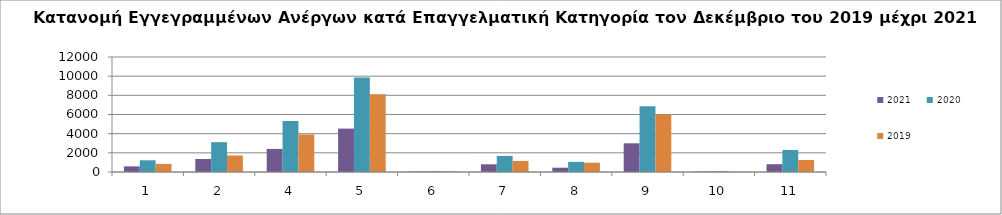
| Category | 2021 | 2020 | 2019 |
|---|---|---|---|
| 1.0 | 589 | 1223 | 843 |
| 2.0 | 1358 | 3111 | 1724 |
| 4.0 | 2407 | 5325 | 3914 |
| 5.0 | 4529 | 9870 | 8117 |
| 6.0 | 40 | 76 | 66 |
| 7.0 | 804 | 1680 | 1155 |
| 8.0 | 448 | 1055 | 969 |
| 9.0 | 2994 | 6864 | 6012 |
| 10.0 | 38 | 89 | 42 |
| 11.0 | 814 | 2293 | 1250 |